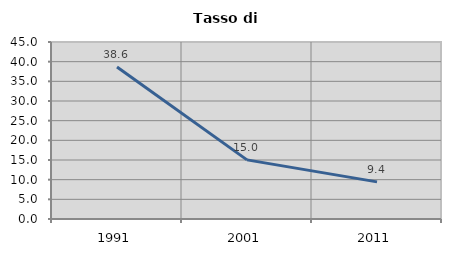
| Category | Tasso di disoccupazione   |
|---|---|
| 1991.0 | 38.649 |
| 2001.0 | 15.034 |
| 2011.0 | 9.443 |